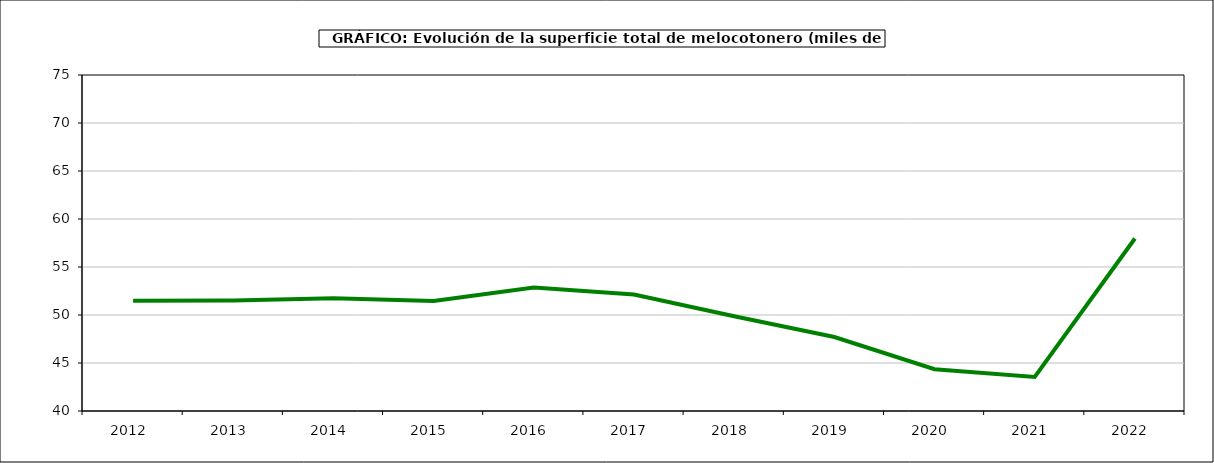
| Category | superficie melocotonero |
|---|---|
| 2012.0 | 51.491 |
| 2013.0 | 51.511 |
| 2014.0 | 51.746 |
| 2015.0 | 51.458 |
| 2016.0 | 52.875 |
| 2017.0 | 52.141 |
| 2018.0 | 49.868 |
| 2019.0 | 47.707 |
| 2020.0 | 44.348 |
| 2021.0 | 43.547 |
| 2022.0 | 57.965 |